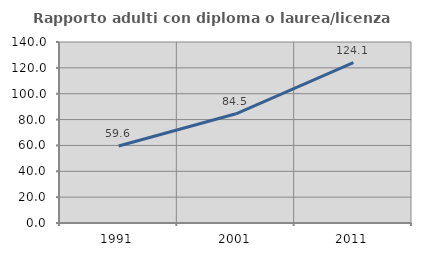
| Category | Rapporto adulti con diploma o laurea/licenza media  |
|---|---|
| 1991.0 | 59.596 |
| 2001.0 | 84.483 |
| 2011.0 | 124.074 |